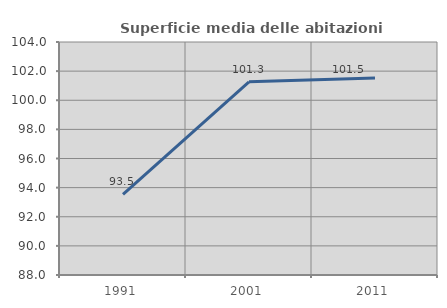
| Category | Superficie media delle abitazioni occupate |
|---|---|
| 1991.0 | 93.538 |
| 2001.0 | 101.265 |
| 2011.0 | 101.536 |